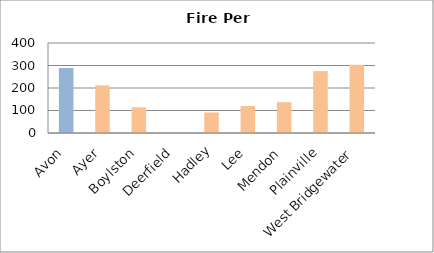
| Category | Series 0 |
|---|---|
| Avon | 288.648 |
| Ayer | 211.565 |
| Boylston | 114.254 |
| Deerfield | 0 |
| Hadley | 91.171 |
| Lee | 119.703 |
| Mendon | 136.947 |
| Plainville | 274.895 |
| West Bridgewater | 303.357 |